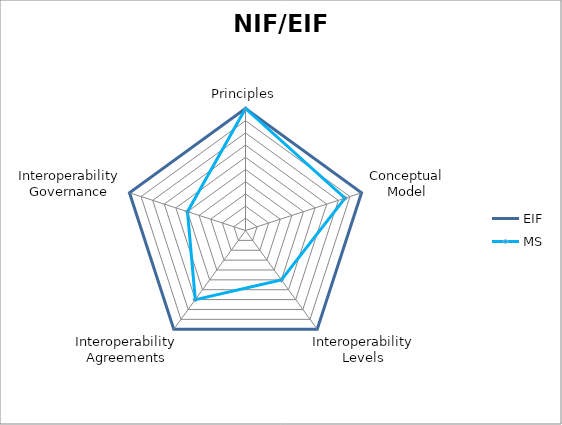
| Category | EIF | MS |
|---|---|---|
| Principles | 1 | 1 |
| Conceptual Model | 1 | 0.857 |
| Interoperability Levels | 1 | 0.5 |
| Interoperability Agreements | 1 | 0.7 |
| Interoperability Governance | 1 | 0.5 |